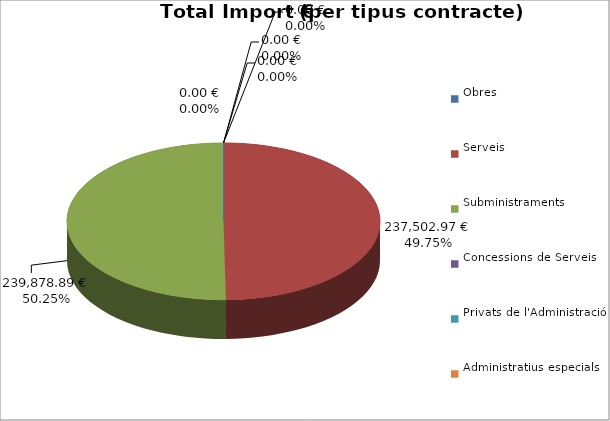
| Category | Total preu
(amb IVA) |
|---|---|
| Obres | 0 |
| Serveis | 237502.97 |
| Subministraments | 239878.89 |
| Concessions de Serveis | 0 |
| Privats de l'Administració | 0 |
| Administratius especials | 0 |